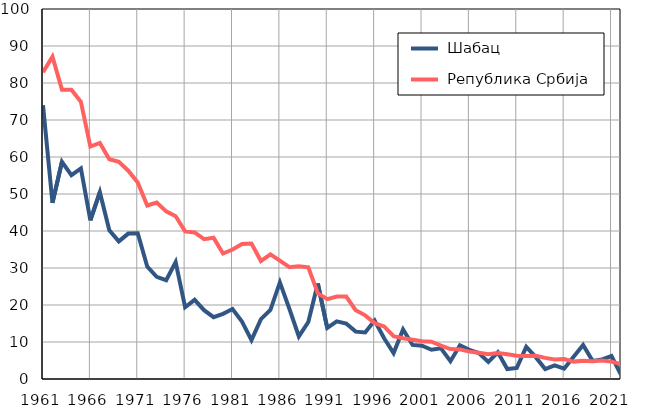
| Category |  Шабац |  Република Србија |
|---|---|---|
| 1961.0 | 74 | 82.9 |
| 1962.0 | 47.6 | 87.1 |
| 1963.0 | 58.7 | 78.2 |
| 1964.0 | 55.1 | 78.2 |
| 1965.0 | 56.9 | 74.9 |
| 1966.0 | 42.9 | 62.8 |
| 1967.0 | 50.5 | 63.8 |
| 1968.0 | 40.2 | 59.4 |
| 1969.0 | 37.2 | 58.7 |
| 1970.0 | 39.3 | 56.3 |
| 1971.0 | 39.4 | 53.1 |
| 1972.0 | 30.4 | 46.9 |
| 1973.0 | 27.6 | 47.7 |
| 1974.0 | 26.7 | 45.3 |
| 1975.0 | 31.6 | 44 |
| 1976.0 | 19.4 | 39.9 |
| 1977.0 | 21.4 | 39.6 |
| 1978.0 | 18.6 | 37.8 |
| 1979.0 | 16.7 | 38.2 |
| 1980.0 | 17.6 | 33.9 |
| 1981.0 | 18.9 | 35 |
| 1982.0 | 15.5 | 36.5 |
| 1983.0 | 10.5 | 36.6 |
| 1984.0 | 16.2 | 31.9 |
| 1985.0 | 18.7 | 33.7 |
| 1986.0 | 26.1 | 32 |
| 1987.0 | 19 | 30.2 |
| 1988.0 | 11.5 | 30.5 |
| 1989.0 | 15.4 | 30.2 |
| 1990.0 | 25.8 | 23.2 |
| 1991.0 | 13.8 | 21.6 |
| 1992.0 | 15.6 | 22.3 |
| 1993.0 | 15 | 22.3 |
| 1994.0 | 12.8 | 18.6 |
| 1995.0 | 12.6 | 17.2 |
| 1996.0 | 15.8 | 15.1 |
| 1997.0 | 11 | 14.2 |
| 1998.0 | 7 | 11.6 |
| 1999.0 | 13.4 | 11 |
| 2000.0 | 9.2 | 10.6 |
| 2001.0 | 9 | 10.2 |
| 2002.0 | 7.9 | 10.1 |
| 2003.0 | 8.3 | 9 |
| 2004.0 | 4.8 | 8.1 |
| 2005.0 | 9.1 | 8 |
| 2006.0 | 7.9 | 7.4 |
| 2007.0 | 7 | 7.1 |
| 2008.0 | 4.6 | 6.7 |
| 2009.0 | 7.2 | 7 |
| 2010.0 | 2.7 | 6.7 |
| 2011.0 | 3 | 6.3 |
| 2012.0 | 8.7 | 6.2 |
| 2013.0 | 5.9 | 6.3 |
| 2014.0 | 2.7 | 5.7 |
| 2015.0 | 3.7 | 5.3 |
| 2016.0 | 2.8 | 5.4 |
| 2017.0 | 6 | 4.7 |
| 2018.0 | 9.2 | 4.9 |
| 2019.0 | 4.9 | 4.8 |
| 2020.0 | 5.3 | 5 |
| 2021.0 | 6.2 | 4.7 |
| 2022.0 | 1.1 | 4 |